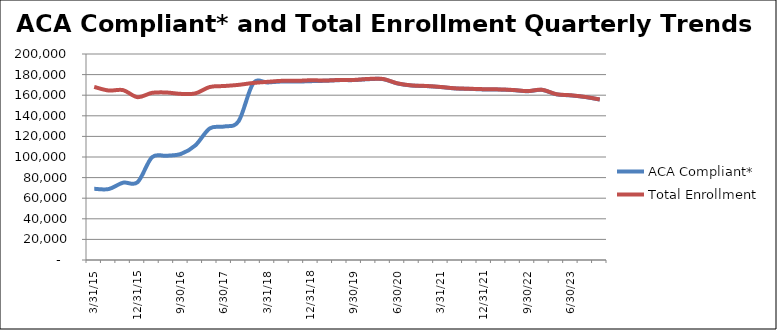
| Category | ACA Compliant* | Total Enrollment |
|---|---|---|
| 3/31/15 | 69126 | 168037 |
| 6/30/15 | 68875 | 164546 |
| 9/30/15 | 75087 | 164923 |
| 12/31/15 | 75530 | 158101 |
| 3/31/16 | 99730 | 162283 |
| 6/30/16 | 101158 | 162620 |
| 9/30/16 | 102958 | 161292 |
| 12/31/16 | 111277 | 161751 |
| 3/31/17 | 127755 | 167960 |
| 6/30/17 | 129612 | 168921 |
| 9/30/17 | 134841 | 170045 |
| 12/31/17 | 171345 | 171879 |
| 3/31/18 | 172356 | 172982 |
| 6/30/18 | 173282 | 173968 |
| 9/30/18 | 173203 | 173927 |
| 12/31/18 | 173637 | 174507 |
| 3/31/19 | 173986 | 174256 |
| 6/30/19 | 174634 | 174819 |
| 9/30/19 | 174671 | 174852 |
| 12/31/19 | 175564 | 175803 |
| 3/31/20 | 175586 | 175739 |
| 6/30/20 | 171336 | 171484 |
| 9/30/20 | 169328 | 169463 |
| 12/31/20 | 168839 | 168965 |
| 3/31/21 | 167879 | 167995 |
| 6/30/21 | 166527 | 166656 |
| 9/30/21 | 166123 | 166255 |
| 12/31/21 | 165575 | 165829 |
| 3/31/22 | 165469 | 165635 |
| 6/30/22 | 164944 | 165084 |
| 9/30/22 | 163854 | 163979 |
| 12/31/22 | 165157 | 165283 |
| 3/31/23 | 160832 | 160962 |
| 6/30/23 | 159798 | 159922 |
| 9/30/23 | 158197 | 158311 |
| 12/31/23 | 155774 | 155885 |